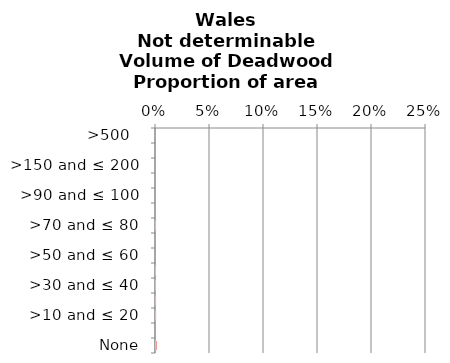
| Category | Not determinable |
|---|---|
|  None | 0.001 |
| >0 and ≤ 10 | 0 |
| >10 and ≤ 20  | 0 |
| >20 and ≤ 30  | 0 |
| >30 and ≤ 40  | 0 |
| >40 and ≤ 50  | 0 |
| >50 and ≤ 60  | 0 |
| >60 and ≤ 70  | 0 |
| >70 and ≤ 80  | 0.001 |
| >80 and ≤ 90  | 0 |
| >90 and ≤ 100  | 0 |
| >100 and ≤ 150 | 0 |
| >150 and ≤ 200  | 0 |
| >200 and ≤ 500 | 0 |
| >500   | 0 |